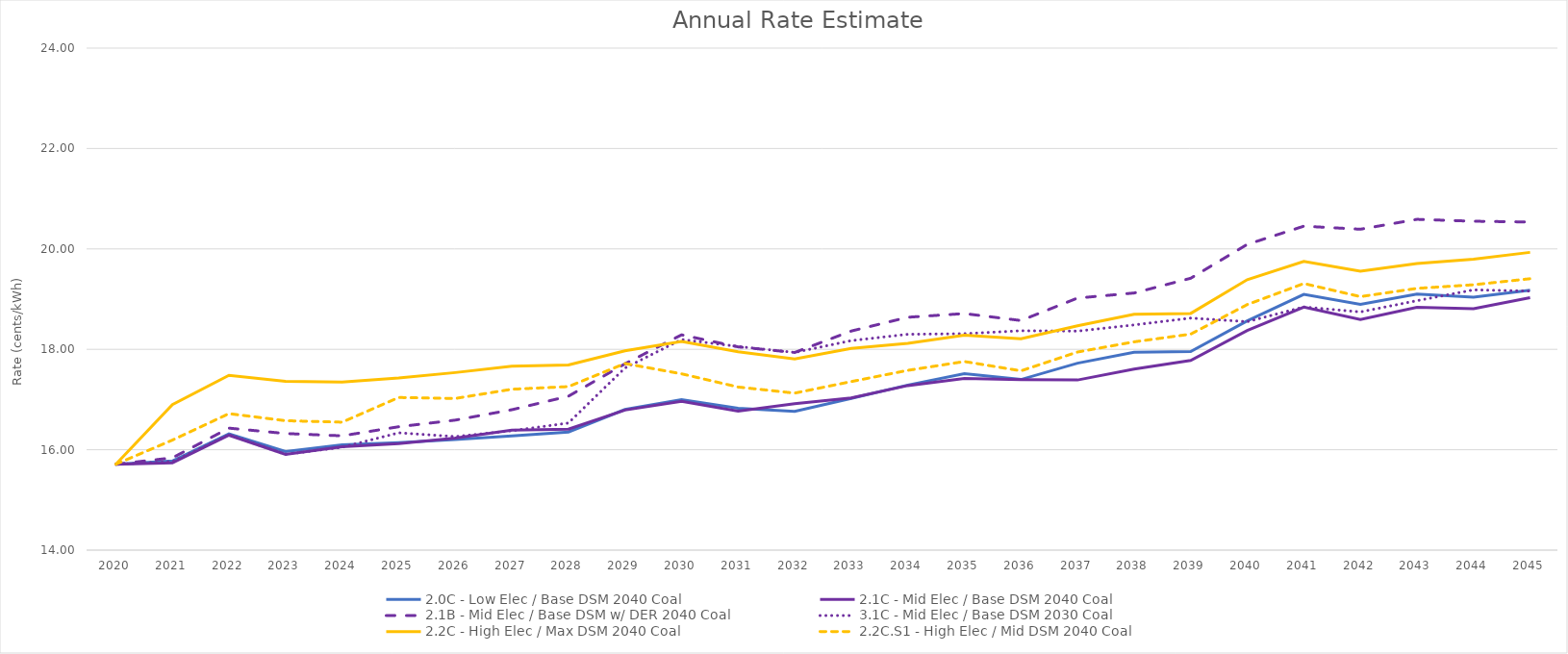
| Category | 2.0C - Low Elec / Base DSM 2040 Coal | 2.1C - Mid Elec / Base DSM 2040 Coal | 2.1B - Mid Elec / Base DSM w/ DER 2040 Coal | 3.1C - Mid Elec / Base DSM 2030 Coal | 2.2C - High Elec / Max DSM 2040 Coal | 2.2C.S1 - High Elec / Mid DSM 2040 Coal |
|---|---|---|---|---|---|---|
| 2020.0 | 15.711 | 15.711 | 15.711 | 15.711 | 15.711 | 15.711 |
| 2021.0 | 15.776 | 15.737 | 15.838 | 15.762 | 16.9 | 16.192 |
| 2022.0 | 16.315 | 16.29 | 16.43 | 16.298 | 17.482 | 16.719 |
| 2023.0 | 15.964 | 15.908 | 16.323 | 15.908 | 17.361 | 16.578 |
| 2024.0 | 16.099 | 16.059 | 16.277 | 16.049 | 17.348 | 16.549 |
| 2025.0 | 16.143 | 16.123 | 16.458 | 16.337 | 17.429 | 17.04 |
| 2026.0 | 16.205 | 16.23 | 16.59 | 16.262 | 17.537 | 17.021 |
| 2027.0 | 16.275 | 16.391 | 16.796 | 16.378 | 17.663 | 17.205 |
| 2028.0 | 16.353 | 16.41 | 17.065 | 16.532 | 17.687 | 17.257 |
| 2029.0 | 16.802 | 16.79 | 17.711 | 17.628 | 17.972 | 17.717 |
| 2030.0 | 16.997 | 16.964 | 18.289 | 18.195 | 18.157 | 17.512 |
| 2031.0 | 16.827 | 16.771 | 18.048 | 18.056 | 17.95 | 17.249 |
| 2032.0 | 16.762 | 16.918 | 17.937 | 17.938 | 17.809 | 17.127 |
| 2033.0 | 17.02 | 17.033 | 18.364 | 18.173 | 18.016 | 17.357 |
| 2034.0 | 17.288 | 17.278 | 18.639 | 18.3 | 18.118 | 17.581 |
| 2035.0 | 17.514 | 17.421 | 18.712 | 18.311 | 18.281 | 17.757 |
| 2036.0 | 17.399 | 17.395 | 18.573 | 18.37 | 18.212 | 17.572 |
| 2037.0 | 17.723 | 17.389 | 19.021 | 18.363 | 18.47 | 17.946 |
| 2038.0 | 17.943 | 17.604 | 19.122 | 18.486 | 18.698 | 18.149 |
| 2039.0 | 17.954 | 17.777 | 19.415 | 18.622 | 18.714 | 18.302 |
| 2040.0 | 18.568 | 18.375 | 20.09 | 18.551 | 19.387 | 18.891 |
| 2041.0 | 19.094 | 18.84 | 20.453 | 18.843 | 19.753 | 19.311 |
| 2042.0 | 18.894 | 18.592 | 20.392 | 18.745 | 19.556 | 19.05 |
| 2043.0 | 19.1 | 18.838 | 20.589 | 18.969 | 19.707 | 19.214 |
| 2044.0 | 19.04 | 18.808 | 20.551 | 19.184 | 19.796 | 19.286 |
| 2045.0 | 19.175 | 19.03 | 20.536 | 19.16 | 19.931 | 19.406 |